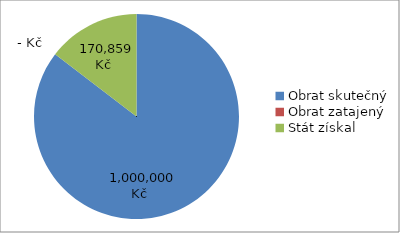
| Category | Series 1 | Series 0 |
|---|---|---|
| Obrat skutečný | 1000000 | 1000000 |
| Obrat zatajený | 0 | 0 |
| Stát získal | 170859.2 | 170859.2 |